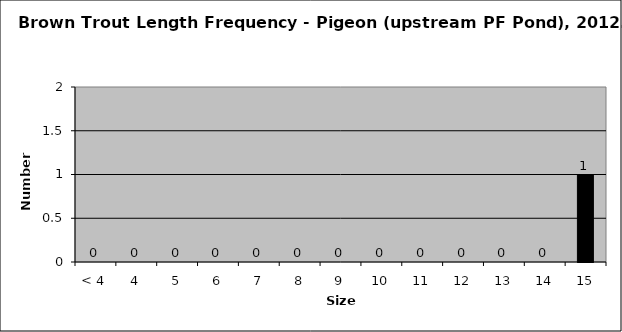
| Category | Series 0 |
|---|---|
| < 4 | 0 |
| 4 | 0 |
| 5 | 0 |
| 6 | 0 |
| 7 | 0 |
| 8 | 0 |
| 9 | 0 |
| 10 | 0 |
| 11 | 0 |
| 12 | 0 |
| 13 | 0 |
| 14 | 0 |
| 15 | 1 |